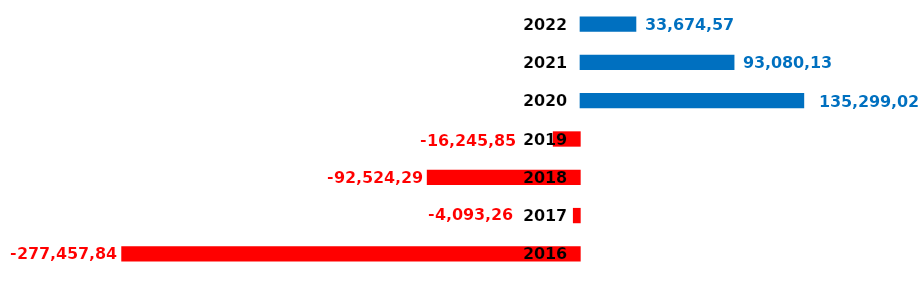
| Category | Risultato dell'esercizio |
|---|---|
| 2016.0 | -277457846.41 |
| 2017.0 | -4093269.27 |
| 2018.0 | -92524290.63 |
| 2019.0 | -16245851.65 |
| 2020.0 | 135299023.57 |
| 2021.0 | 93080130.83 |
| 2022.0 | 33674575.8 |